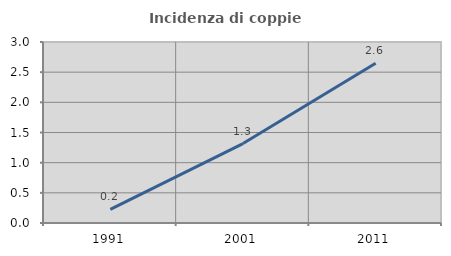
| Category | Incidenza di coppie miste |
|---|---|
| 1991.0 | 0.227 |
| 2001.0 | 1.317 |
| 2011.0 | 2.647 |